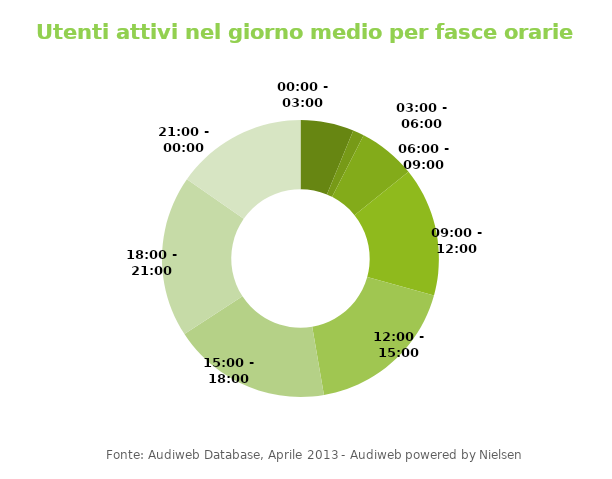
| Category | Series 0 |
|---|---|
| 00:00 - 03:00 | 2550 |
| 03:00 - 06:00 | 538 |
| 06:00 - 09:00 | 2743 |
| 09:00 - 12:00 | 6173 |
| 12:00 - 15:00 | 7375 |
| 15:00 - 18:00 | 7588 |
| 18:00 - 21:00 | 7738 |
| 21:00 - 00:00 | 6271 |